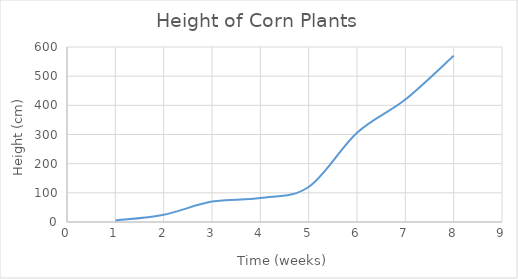
| Category | Height (cm) |
|---|---|
| 1.0 | 5 |
| 2.0 | 25 |
| 3.0 | 70 |
| 4.0 | 82 |
| 5.0 | 120 |
| 6.0 | 306 |
| 7.0 | 420 |
| 8.0 | 570 |